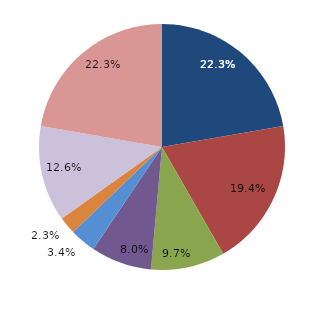
| Category | Series 0 |
|---|---|
| قبل الدخول
Before Consummation | 22.286 |
| -1 | 19.429 |
| 1 | 9.714 |
| 2 | 8 |
| 3 | 3.429 |
| 4 | 2.286 |
|  5 - 9 | 12.571 |
| 10+ | 22.286 |